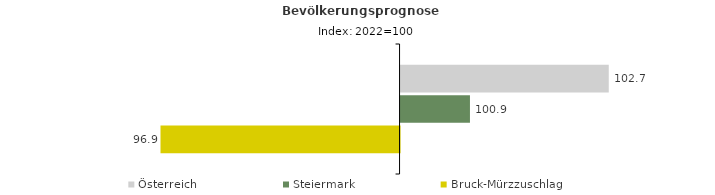
| Category | Österreich | Steiermark | Bruck-Mürzzuschlag |
|---|---|---|---|
| 2022.0 | 102.7 | 100.9 | 96.9 |